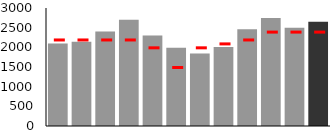
| Category | Footfall |
|---|---|
| Jan | 2100 |
| Feb | 2145 |
| Mar | 2400 |
| April | 2700 |
| May | 2300 |
| Jun | 1987 |
| Jul | 1843 |
| Aug | 2008 |
| Sep | 2461 |
| Oct | 2743 |
| Nov | 2500 |
| Dec | 2649 |